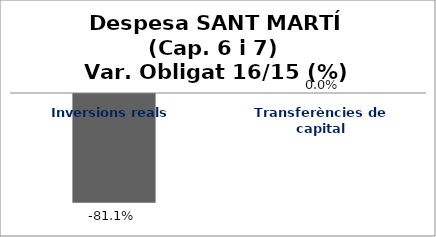
| Category | Series 0 |
|---|---|
| Inversions reals | -0.811 |
| Transferències de capital | 0 |